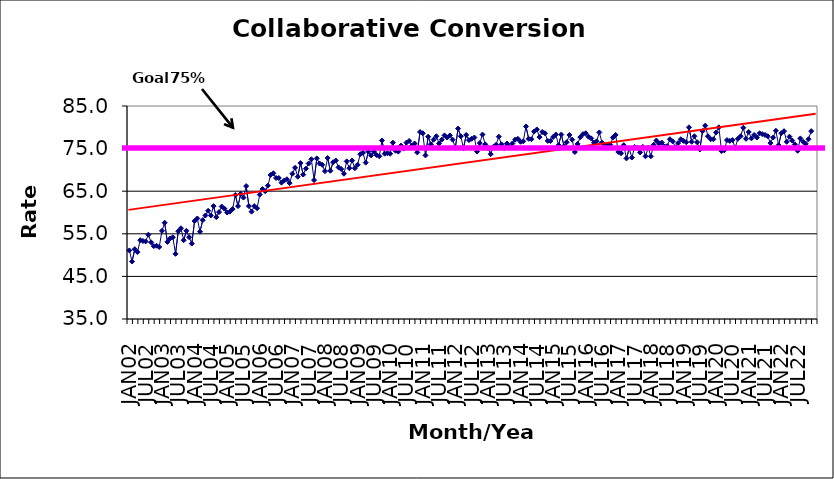
| Category | Series 0 |
|---|---|
| JAN02 | 51.1 |
| FEB02 | 48.5 |
| MAR02 | 51.4 |
| APR02 | 50.7 |
| MAY02 | 53.5 |
| JUN02 | 53.3 |
| JUL02 | 53.2 |
| AUG02 | 54.8 |
| SEP02 | 53 |
| OCT02 | 52.1 |
| NOV02 | 52.2 |
| DEC02 | 51.9 |
| JAN03 | 55.7 |
| FEB03 | 57.6 |
| MAR03 | 53.1 |
| APR03 | 53.9 |
| MAY03 | 54.2 |
| JUN03 | 50.3 |
| JUL03 | 55.6 |
| AUG03 | 56.3 |
| SEP03 | 53.5 |
| OCT03 | 55.7 |
| NOV03 | 54.2 |
| DEC03 | 52.7 |
| JAN04 | 58 |
| FEB04 | 58.6 |
| MAR04 | 55.5 |
| APR04 | 58.2 |
| MAY04 | 59.3 |
| JUN04 | 60.4 |
| JUL04 | 59.3 |
| AUG04 | 61.5 |
| SEP04 | 58.9 |
| OCT04 | 60.1 |
| NOV04 | 61.4 |
| DEC04 | 60.9 |
| JAN05 | 60 |
| FEB05 | 60.2 |
| MAR05 | 60.8 |
| APR05 | 64.1 |
| MAY05 | 61.5 |
| JUN05 | 64.4 |
| JUL05 | 63.5 |
| AUG05 | 66.2 |
| SEP05 | 61.5 |
| OCT05 | 60.2 |
| NOV05 | 61.5 |
| DEC05 | 61 |
| JAN06 | 64.2 |
| FEB06 | 65.5 |
| MAR06 | 65 |
| APR06 | 66.3 |
| MAY06 | 68.8 |
| JUN06 | 69.2 |
| JUL06 | 68.1 |
| AUG06 | 68.1 |
| SEP06 | 67 |
| OCT06 | 67.5 |
| NOV06 | 67.8 |
| DEC06 | 66.9 |
| JAN07 | 69.1 |
| FEB07 | 70.5 |
| MAR07 | 68.4 |
| APR07 | 71.6 |
| MAY07 | 68.9 |
| JUN07 | 70.3 |
| JUL07 | 71.5 |
| AUG07 | 72.5 |
| SEP07 | 67.6 |
| OCT07 | 72.7 |
| NOV07 | 71.5 |
| DEC07 | 71.2 |
| JAN08 | 69.7 |
| FEB08 | 72.8 |
| MAR08 | 69.8 |
| APR08 | 71.8 |
| MAY08 | 72.2 |
| JUN08 | 70.6 |
| JUL08 | 70.2 |
| AUG08 | 69.1 |
| SEP08 | 72 |
| OCT08 | 70.4 |
| NOV08 | 72.2 |
| DEC08 | 70.4 |
| JAN09 | 71.2 |
| FEB09 | 73.7 |
| MAR09 | 74 |
| APR09 | 71.7 |
| MAY09 | 74.3 |
| JUN09 | 73.4 |
| JUL09 | 74.3 |
| AUG09 | 73.5 |
| SEP09 | 73.2 |
| OCT09 | 76.9 |
| NOV09 | 73.8 |
| DEC09 | 73.9 |
| JAN10 | 73.8 |
| FEB10 | 76.4 |
| MAR10 | 74.5 |
| APR10 | 74.3 |
| MAY10 | 75.7 |
| JUN10 | 75 |
| JUL10 | 76.4 |
| AUG10 | 76.8 |
| SEP10 | 75.7 |
| OCT10 | 76.2 |
| NOV10 | 74.1 |
| DEC10 | 78.9 |
| JAN11 | 78.6 |
| FEB11 | 73.4 |
| MAR11 | 77.8 |
| APR11 | 76 |
| MAY11 | 77.1 |
| JUN11 | 77.9 |
| JUL11 | 76.2 |
| AUG11 | 77.1 |
| SEP11 | 78.1 |
| OCT11 | 77.6 |
| NOV11 | 78.1 |
| DEC11 | 77.1 |
| JAN12 | 75.2 |
| FEB12 | 79.7 |
| MAR12 | 77.9 |
| APR12 | 75.1 |
| MAY12 | 78.2 |
| JUN12 | 77 |
| JUL12 | 77.3 |
| AUG12 | 77.6 |
| SEP12 | 74.3 |
| OCT12 | 76.3 |
| NOV12 | 78.3 |
| DEC12 | 76 |
| JAN13 | 75.1 |
| FEB13 | 73.7 |
| MAR13 | 75.4 |
| APR13 | 75.9 |
| MAY13 | 77.8 |
| JUN13 | 76 |
| JUL13 | 75.1 |
| AUG13 | 76.2 |
| SEP13 | 75.4 |
| OCT13 | 76.2 |
| NOV13 | 77.1 |
| DEC13 | 77.3 |
| JAN14 | 76.6 |
| FEB14 | 76.7 |
| MAR14 | 80.2 |
| APR14 | 77.3 |
| MAY14 | 77.2 |
| JUN14 | 79 |
| JUL14 | 79.5 |
| AUG14 | 77.7 |
| SEP14 | 78.9 |
| OCT14 | 78.6 |
| NOV14 | 76.8 |
| DEC14 | 76.8 |
| JAN15 | 77.7 |
| FEB15 | 78.3 |
| MAR15 | 75.8 |
| APR15 | 78.3 |
| MAY15 | 75.6 |
| JUN15 | 76.5 |
| JUL15 | 78.2 |
| AUG15 | 77.1 |
| SEP15 | 74.2 |
| OCT15 | 76.1 |
| NOV15 | 77.7 |
| DEC15 | 78.4 |
| JAN16 | 78.6 |
| FEB16 | 77.8 |
| MAR16 | 77.4 |
| APR16 | 76.4 |
| MAY16 | 76.7 |
| JUN16 | 78.8 |
| JUL16 | 76.4 |
| AUG16 | 75.5 |
| SEP16 | 75.9 |
| OCT16 | 75.9 |
| NOV16 | 77.6 |
| DEC16 | 78.2 |
| JAN17 | 74.2 |
| FEB17 | 73.9 |
| MAR17 | 75.8 |
| APR17 | 72.7 |
| MAY17 | 75 |
| JUN17 | 72.9 |
| JUL17 | 75.4 |
| AUG17 | 75.2 |
| SEP17 | 74.1 |
| OCT17 | 75.4 |
| NOV17 | 73.2 |
| DEC17 | 75.2 |
| JAN18 | 73.2 |
| FEB18 | 75.9 |
| MAR18 | 76.9 |
| APR18 | 76.2 |
| MAY18 | 76.4 |
| JUN18 | 75.5 |
| JUL18 | 75.6 |
| AUG18 | 77.2 |
| SEP18 | 76.7 |
| OCT18 | 75.3 |
| NOV18 | 76.3 |
| DEC18 | 77.2 |
| JAN19 | 76.8 |
| FEB19 | 76.5 |
| MAR19 | 80 |
| APR19 | 76.6 |
| MAY19 | 77.9 |
| JUN19 | 76.5 |
| JUL19 | 74.8 |
| AUG19 | 79.1 |
| SEP19 | 80.4 |
| OCT19 | 77.9 |
| NOV19 | 77.2 |
| DEC19 | 77.2 |
| JAN20 | 78.8 |
| FEB20 | 80 |
| MAR20 | 74.4 |
| APR20 | 74.6 |
| MAY20 | 77 |
| JUN20 | 76.8 |
| JUL20 | 77 |
| AUG20 | 75.2 |
| SEP20 | 77.3 |
| OCT20 | 77.9 |
| NOV20 | 79.9 |
| DEC20 | 77.3 |
| JAN21 | 78.9 |
| FEB21 | 77.4 |
| MAR21 | 78.2 |
| APR21 | 77.6 |
| MAY21 | 78.6 |
| JUN21 | 78.4 |
| JUL21 | 78.2 |
| AUG21 | 77.9 |
| SEP21 | 76.3 |
| OCT21 | 77.6 |
| NOV21 | 79.2 |
| DEC21 | 75.8 |
| JAN22 | 78.6 |
| FEB22 | 79.1 |
| MAR22 | 76.6 |
| APR22 | 77.8 |
| MAY22 | 76.9 |
| JUN22 | 76 |
| JUL22 | 74.5 |
| AUG22 | 77.4 |
| SEP22 | 76.6 |
| OCT22 | 76.1 |
| NOV22 | 77.2 |
| DEC22 | 79.1 |